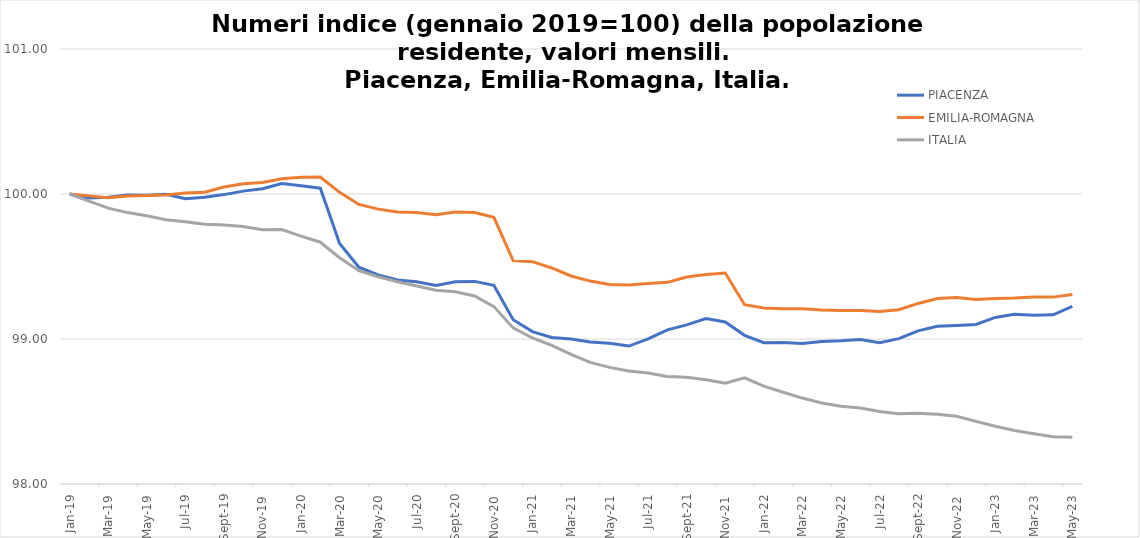
| Category | PIACENZA | EMILIA-ROMAGNA | ITALIA |
|---|---|---|---|
| 2019-01-01 | 100 | 100 | 100 |
| 2019-02-01 | 99.972 | 99.987 | 99.951 |
| 2019-03-01 | 99.978 | 99.974 | 99.903 |
| 2019-04-01 | 99.992 | 99.986 | 99.872 |
| 2019-05-01 | 99.992 | 99.99 | 99.849 |
| 2019-06-01 | 99.998 | 99.994 | 99.822 |
| 2019-07-01 | 99.968 | 100.007 | 99.809 |
| 2019-08-01 | 99.978 | 100.012 | 99.792 |
| 2019-09-01 | 99.996 | 100.048 | 99.786 |
| 2019-10-01 | 100.02 | 100.07 | 99.776 |
| 2019-11-01 | 100.036 | 100.08 | 99.754 |
| 2019-12-01 | 100.073 | 100.106 | 99.755 |
| 2020-01-01 | 100.056 | 100.115 | 99.709 |
| 2020-02-01 | 100.04 | 100.118 | 99.668 |
| 2020-03-01 | 99.659 | 100.011 | 99.56 |
| 2020-04-01 | 99.496 | 99.928 | 99.471 |
| 2020-05-01 | 99.441 | 99.896 | 99.429 |
| 2020-06-01 | 99.407 | 99.876 | 99.395 |
| 2020-07-01 | 99.394 | 99.872 | 99.365 |
| 2020-08-01 | 99.369 | 99.857 | 99.336 |
| 2020-09-01 | 99.395 | 99.876 | 99.326 |
| 2020-10-01 | 99.397 | 99.872 | 99.296 |
| 2020-11-01 | 99.37 | 99.84 | 99.223 |
| 2020-12-01 | 99.133 | 99.541 | 99.077 |
| 2021-01-01 | 99.051 | 99.533 | 99.007 |
| 2021-02-01 | 99.011 | 99.49 | 98.957 |
| 2021-03-01 | 99 | 99.435 | 98.894 |
| 2021-04-01 | 98.979 | 99.399 | 98.839 |
| 2021-05-01 | 98.97 | 99.375 | 98.804 |
| 2021-06-01 | 98.951 | 99.372 | 98.78 |
| 2021-07-01 | 99.001 | 99.383 | 98.765 |
| 2021-08-01 | 99.063 | 99.391 | 98.741 |
| 2021-09-01 | 99.098 | 99.427 | 98.737 |
| 2021-10-01 | 99.141 | 99.444 | 98.719 |
| 2021-11-01 | 99.118 | 99.455 | 98.695 |
| 2021-12-01 | 99.025 | 99.237 | 98.732 |
| 2022-01-01 | 98.975 | 99.214 | 98.675 |
| 2022-02-01 | 98.976 | 99.209 | 98.633 |
| 2022-03-01 | 98.969 | 99.209 | 98.593 |
| 2022-04-01 | 98.983 | 99.2 | 98.559 |
| 2022-05-01 | 98.987 | 99.196 | 98.536 |
| 2022-06-01 | 98.996 | 99.197 | 98.524 |
| 2022-07-01 | 98.974 | 99.19 | 98.501 |
| 2022-08-01 | 99.003 | 99.202 | 98.485 |
| 2022-09-01 | 99.056 | 99.245 | 98.487 |
| 2022-10-01 | 99.088 | 99.279 | 98.48 |
| 2022-11-01 | 99.093 | 99.286 | 98.467 |
| 2022-12-01 | 99.1 | 99.272 | 98.432 |
| 2023-01-01 | 99.149 | 99.279 | 98.398 |
| 2023-02-01 | 99.17 | 99.283 | 98.368 |
| 2023-03-01 | 99.163 | 99.29 | 98.347 |
| 2023-04-01 | 99.167 | 99.289 | 98.326 |
| 2023-05-01 | 99.225 | 99.307 | 98.322 |